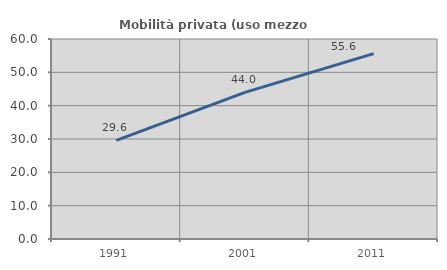
| Category | Mobilità privata (uso mezzo privato) |
|---|---|
| 1991.0 | 29.575 |
| 2001.0 | 43.969 |
| 2011.0 | 55.606 |